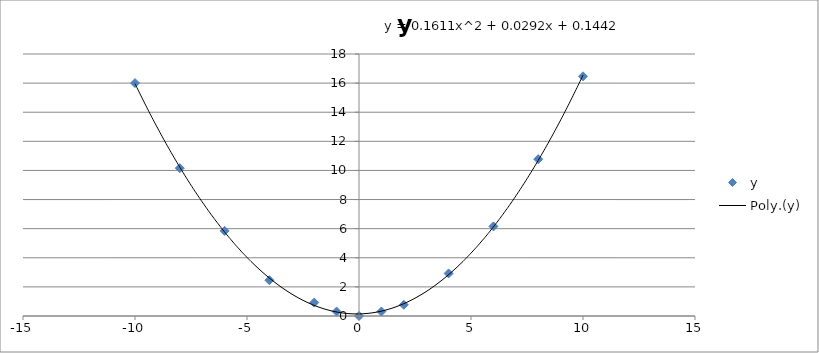
| Category | y |
|---|---|
| -10.0 | 16.005 |
| -8.0 | 10.157 |
| -6.0 | 5.848 |
| -4.0 | 2.462 |
| -2.0 | 0.923 |
| -1.0 | 0.308 |
| 0.0 | 0 |
| 1.0 | 0.308 |
| 2.0 | 0.769 |
| 4.0 | 2.924 |
| 6.0 | 6.156 |
| 8.0 | 10.773 |
| 10.0 | 16.467 |